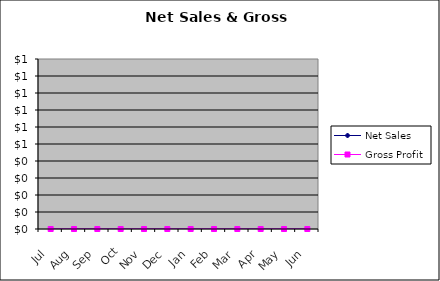
| Category | Net Sales | Gross Profit |
|---|---|---|
| Jul | 0 | 0 |
| Aug | 0 | 0 |
| Sep | 0 | 0 |
| Oct | 0 | 0 |
| Nov | 0 | 0 |
| Dec | 0 | 0 |
| Jan | 0 | 0 |
| Feb | 0 | 0 |
| Mar | 0 | 0 |
| Apr | 0 | 0 |
| May | 0 | 0 |
| Jun | 0 | 0 |